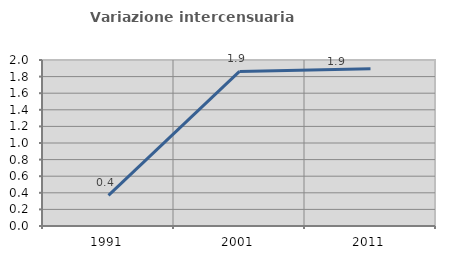
| Category | Variazione intercensuaria annua |
|---|---|
| 1991.0 | 0.369 |
| 2001.0 | 1.862 |
| 2011.0 | 1.895 |